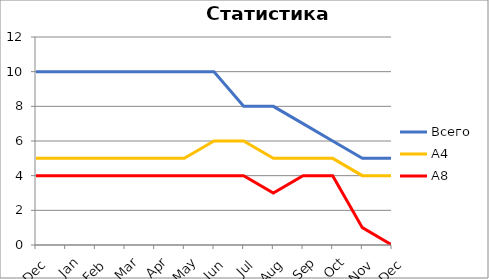
| Category | Всего | А4 | A8 |
|---|---|---|---|
| 0 | 10 | 5 | 4 |
| 1 | 10 | 5 | 4 |
| 2 | 10 | 5 | 4 |
| 3 | 10 | 5 | 4 |
| 4 | 10 | 5 | 4 |
| 5 | 10 | 5 | 4 |
| 6 | 10 | 6 | 4 |
| 7 | 8 | 6 | 4 |
| 8 | 8 | 5 | 3 |
| 9 | 7 | 5 | 4 |
| 10 | 6 | 5 | 4 |
| 11 | 5 | 4 | 1 |
| 12 | 5 | 4 | 0 |